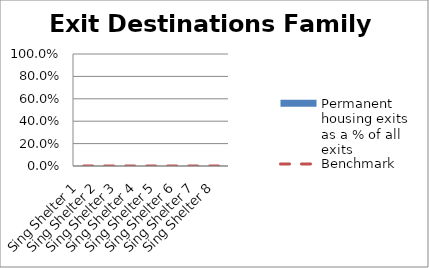
| Category | Permanent housing exits as a % of all exits |
|---|---|
| Sing Shelter 1 | 0 |
| Sing Shelter 2 | 0 |
| Sing Shelter 3 | 0 |
| Sing Shelter 4 | 0 |
| Sing Shelter 5 | 0 |
| Sing Shelter 6 | 0 |
| Sing Shelter 7 | 0 |
| Sing Shelter 8 | 0 |